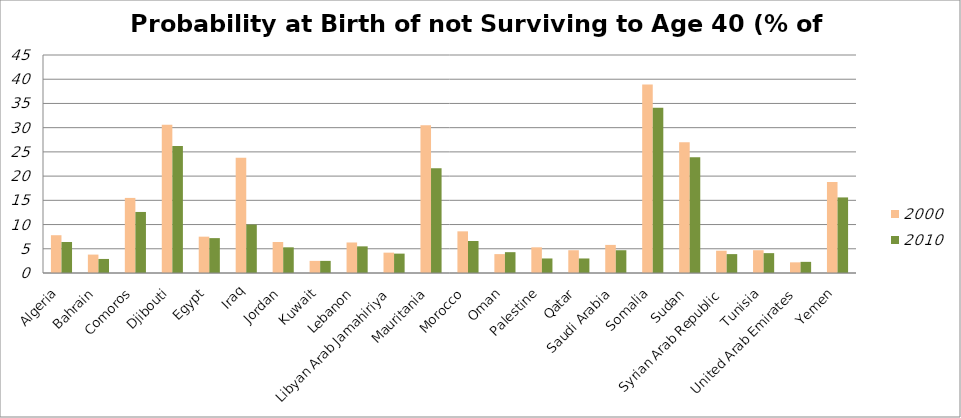
| Category | 2000 | 2010 |
|---|---|---|
| Algeria | 7.8 | 6.4 |
| Bahrain | 3.8 | 2.9 |
| Comoros | 15.5 | 12.6 |
| Djibouti | 30.6 | 26.2 |
| Egypt | 7.5 | 7.2 |
| Iraq | 23.8 | 10 |
| Jordan | 6.4 | 5.3 |
| Kuwait | 2.5 | 2.5 |
| Lebanon | 6.3 | 5.5 |
| Libyan Arab Jamahiriya | 4.2 | 4 |
| Mauritania | 30.5 | 21.6 |
| Morocco | 8.6 | 6.6 |
| Oman | 3.9 | 4.3 |
| Palestine | 5.3 | 3 |
| Qatar | 4.7 | 3 |
| Saudi Arabia | 5.8 | 4.7 |
| Somalia | 38.9 | 34.1 |
| Sudan | 27 | 23.9 |
| Syrian Arab Republic | 4.6 | 3.9 |
| Tunisia | 4.7 | 4.1 |
| United Arab Emirates | 2.2 | 2.3 |
| Yemen | 18.8 | 15.6 |